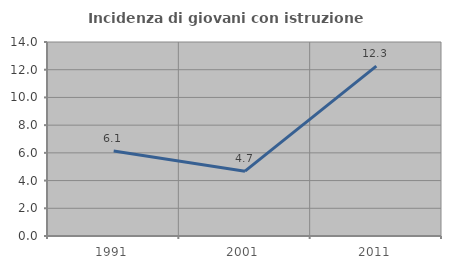
| Category | Incidenza di giovani con istruzione universitaria |
|---|---|
| 1991.0 | 6.129 |
| 2001.0 | 4.676 |
| 2011.0 | 12.255 |